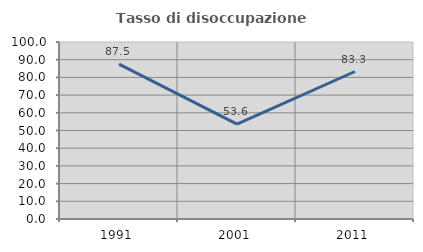
| Category | Tasso di disoccupazione giovanile  |
|---|---|
| 1991.0 | 87.5 |
| 2001.0 | 53.571 |
| 2011.0 | 83.333 |